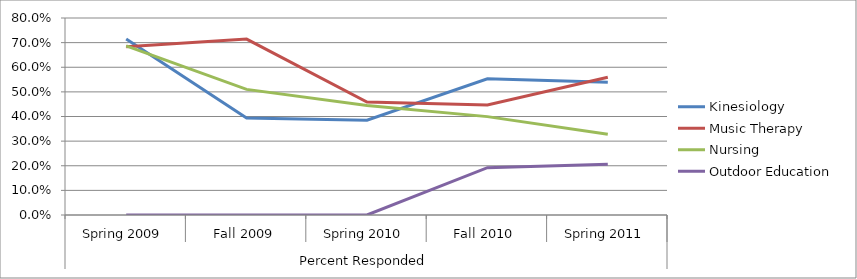
| Category | Kinesiology | Music Therapy | Nursing | Outdoor Education  |
|---|---|---|---|---|
| 0 | 0.714 | 0.683 | 0.687 | 0 |
| 1 | 0.394 | 0.714 | 0.51 | 0 |
| 2 | 0.385 | 0.459 | 0.445 | 0 |
| 3 | 0.553 | 0.447 | 0.399 | 0.192 |
| 4 | 0.539 | 0.559 | 0.328 | 0.206 |